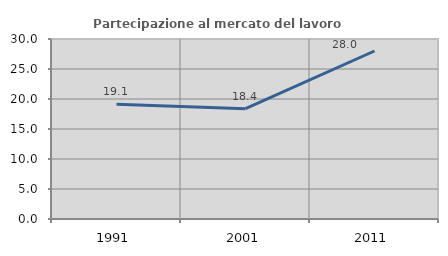
| Category | Partecipazione al mercato del lavoro  femminile |
|---|---|
| 1991.0 | 19.111 |
| 2001.0 | 18.376 |
| 2011.0 | 28 |